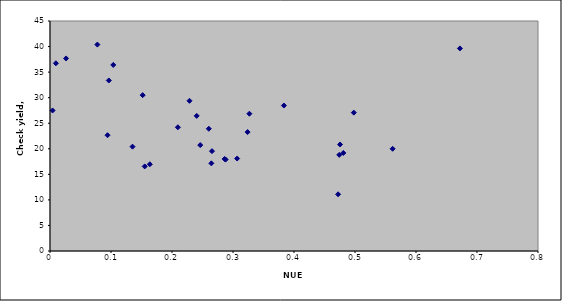
| Category | 0-40-60 |
|---|---|
| 0.00965999999999994 | 36.725 |
| -0.08431799999999995 | 27.95 |
| 0.15529139999999994 | 16.547 |
| 0.32686335000000016 | 26.862 |
| 0.3239411999999999 | 23.262 |
| 0.16364039999999996 | 16.97 |
| 0.24629549999999995 | 20.721 |
| 0.026323500000000024 | 37.675 |
| 0.4754789999999998 | 20.842 |
| 0.26551199999999997 | 19.542 |
| 0.004174500000000023 | 27.498 |
| -0.015456000000000074 | 38.538 |
| 0.09639299999999999 | 33.365 |
| 0.13527449999999994 | 20.418 |
| 0.07765950000000003 | 40.382 |
| 0.15193799999999988 | 30.492 |
| 0.49800749999999994 | 27.072 |
| 0.3068085 | 18.09 |
| 0.240465 | 26.438 |
| 0.09432299999999995 | 22.655 |
| 0.2878317750000001 | 17.89 |
| 0.26449631999999995 | 17.152 |
| 0.47226118500000014 | 11.093 |
| 0.22866619319999998 | 29.386 |
| 0.28633970934 | 18.014 |
| 0.47416681872000005 | 18.808 |
| 0.38347530113999995 | 28.464 |
| 0.48082752948000007 | 19.184 |
| 0.20962506360000005 | 24.207 |
| -0.08773790910000002 | 27.522 |
| 0.10373347391999985 | 36.399 |
| 0.6719926822199999 | 39.634 |
| 0.5616600000000002 | 20 |
| 0.26030624394 | 23.917 |